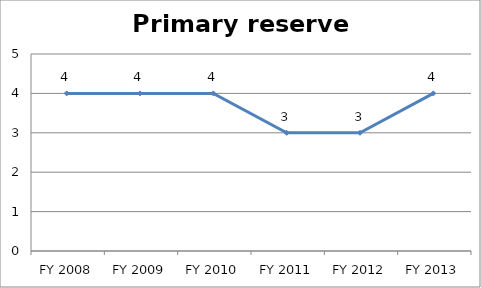
| Category | Primary reserve score |
|---|---|
| FY 2013 | 4 |
| FY 2012 | 3 |
| FY 2011 | 3 |
| FY 2010 | 4 |
| FY 2009 | 4 |
| FY 2008 | 4 |